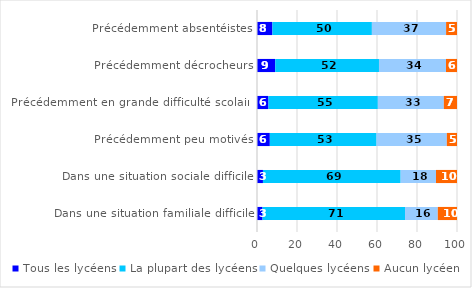
| Category | Tous les lycéens | La plupart des lycéens | Quelques lycéens | Aucun lycéen |
|---|---|---|---|---|
| Précédemment absentéistes | 7.711 | 49.732 | 37.11 | 5.447 |
| Précédemment décrocheurs | 9.118 | 51.874 | 33.501 | 5.507 |
| Précédemment en grande difficulté scolaire | 5.733 | 54.69 | 33 | 6.576 |
| Précédemment peu motivés | 6.414 | 53.353 | 35.151 | 5.082 |
| Dans une situation sociale difficile | 2.976 | 68.845 | 17.679 | 10.499 |
| Dans une situation familiale difficile | 2.781 | 71.235 | 16.386 | 9.598 |